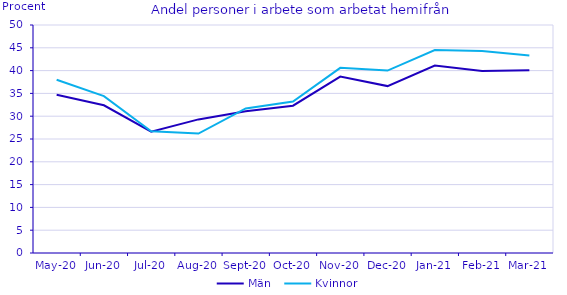
| Category | Män | Kvinnor |
|---|---|---|
| 2020-05-01 | 34.7 | 38 |
| 2020-06-01 | 32.4 | 34.4 |
| 2020-07-01 | 26.6 | 26.7 |
| 2020-08-01 | 29.3 | 26.2 |
| 2020-09-01 | 31.1 | 31.7 |
| 2020-10-01 | 32.3 | 33.2 |
| 2020-11-01 | 38.7 | 40.6 |
| 2020-12-01 | 36.6 | 40 |
| 2021-01-01 | 41.1 | 44.5 |
| 2021-02-01 | 39.9 | 44.3 |
| 2021-03-01 | 40.1 | 43.3 |